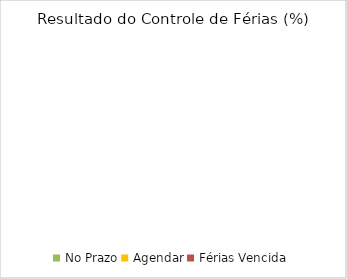
| Category | Total |
|---|---|
| No Prazo | 0 |
| Agendar | 0 |
| Férias Vencida | 0 |